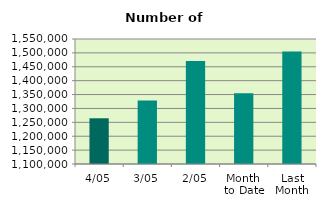
| Category | Series 0 |
|---|---|
| 4/05 | 1264550 |
| 3/05 | 1328442 |
| 2/05 | 1470690 |
| Month 
to Date | 1354560.667 |
| Last
Month | 1505043.474 |